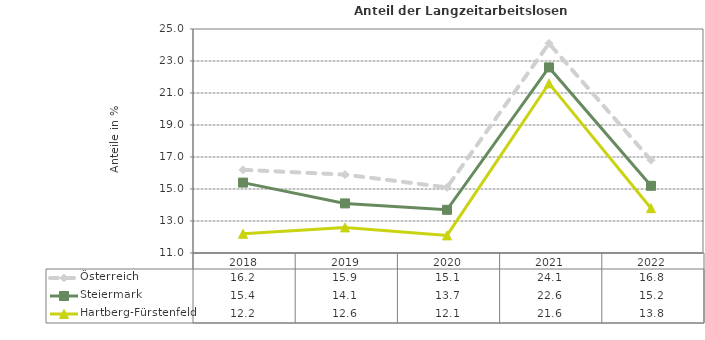
| Category | Österreich | Steiermark | Hartberg-Fürstenfeld |
|---|---|---|---|
| 2022.0 | 16.8 | 15.2 | 13.8 |
| 2021.0 | 24.1 | 22.6 | 21.6 |
| 2020.0 | 15.1 | 13.7 | 12.1 |
| 2019.0 | 15.9 | 14.1 | 12.6 |
| 2018.0 | 16.2 | 15.4 | 12.2 |